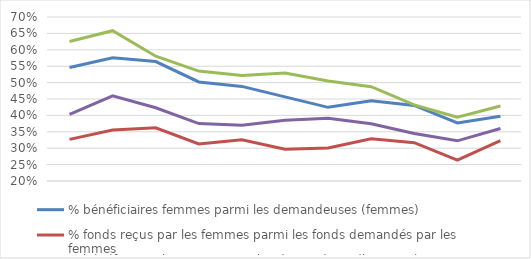
| Category | % bénéficiaires femmes parmi les demandeuses (femmes) | % fonds reçus par les femmes parmi les fonds demandés par les femmes | % bénéficiaires hommes parmi les demandeurs (hommes) | % fonds reçus par les hommes parmi les fonds demandés par les hommes |
|---|---|---|---|---|
|  | 0.546 | 0.327 | 0.625 | 0.403 |
|  | 0.576 | 0.356 | 0.658 | 0.46 |
|  | 0.564 | 0.362 | 0.58 | 0.423 |
|  | 0.502 | 0.313 | 0.535 | 0.375 |
|  | 0.488 | 0.326 | 0.522 | 0.37 |
|  | 0.457 | 0.297 | 0.529 | 0.385 |
|  | 0.425 | 0.301 | 0.505 | 0.392 |
|  | 0.444 | 0.329 | 0.487 | 0.374 |
|  | 0.43 | 0.317 | 0.432 | 0.345 |
|  | 0.377 | 0.264 | 0.395 | 0.322 |
|  | 0.398 | 0.323 | 0.429 | 0.36 |